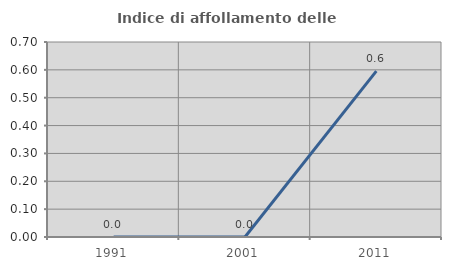
| Category | Indice di affollamento delle abitazioni  |
|---|---|
| 1991.0 | 0 |
| 2001.0 | 0 |
| 2011.0 | 0.595 |